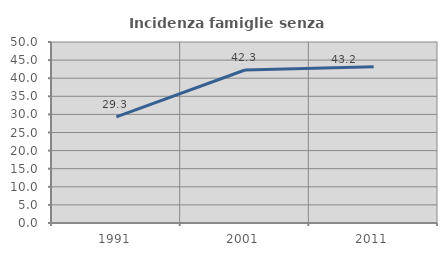
| Category | Incidenza famiglie senza nuclei |
|---|---|
| 1991.0 | 29.339 |
| 2001.0 | 42.268 |
| 2011.0 | 43.151 |